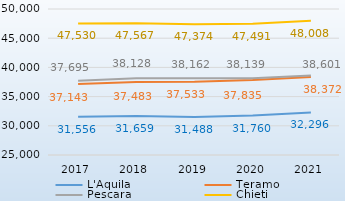
| Category | L'Aquila | Teramo | Pescara | Chieti |
|---|---|---|---|---|
| 2017.0 | 31556 | 37143 | 37695 | 47530 |
| 2018.0 | 31659 | 37483 | 38128 | 47567 |
| 2019.0 | 31488 | 37533 | 38162 | 47374 |
| 2020.0 | 31760 | 37835 | 38139 | 47491 |
| 2021.0 | 32296 | 38372 | 38601 | 48008 |